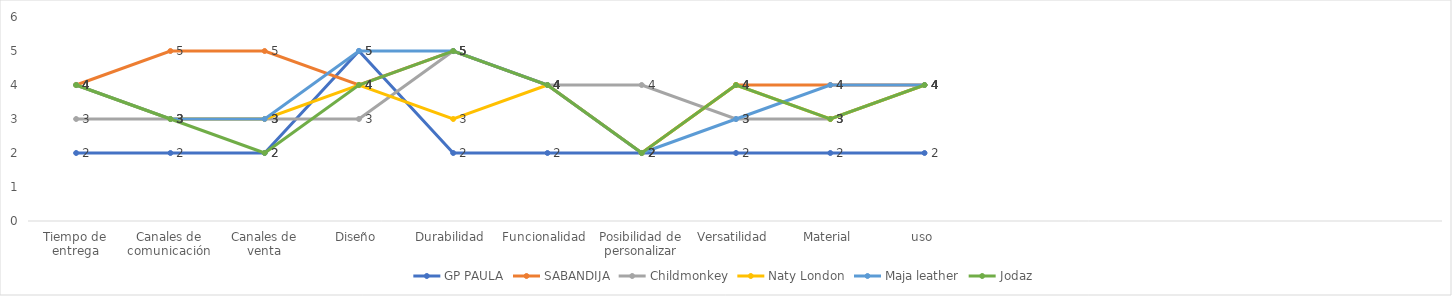
| Category | GP PAULA | SABANDIJA | Childmonkey | Naty London | Maja leather | Jodaz |
|---|---|---|---|---|---|---|
| Tiempo de entrega | 2 | 4 | 3 | 4 | 4 | 4 |
| Canales de comunicación | 2 | 5 | 3 | 3 | 3 | 3 |
| Canales de venta | 2 | 5 | 3 | 3 | 3 | 2 |
| Diseño | 5 | 4 | 3 | 4 | 5 | 4 |
| Durabilidad | 2 | 5 | 5 | 3 | 5 | 5 |
| Funcionalidad | 2 | 4 | 4 | 4 | 4 | 4 |
| Posibilidad de personalizar | 2 | 2 | 4 | 2 | 2 | 2 |
| Versatilidad | 2 | 4 | 3 | 4 | 3 | 4 |
| Material | 2 | 4 | 3 | 3 | 4 | 3 |
| uso | 2 | 4 | 4 | 4 | 4 | 4 |